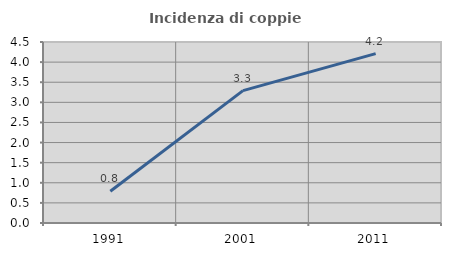
| Category | Incidenza di coppie miste |
|---|---|
| 1991.0 | 0.79 |
| 2001.0 | 3.292 |
| 2011.0 | 4.211 |